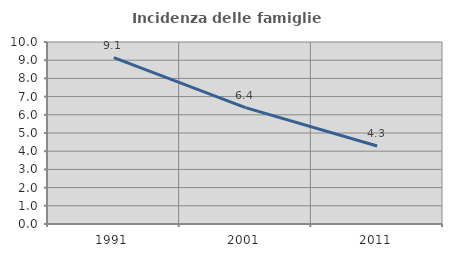
| Category | Incidenza delle famiglie numerose |
|---|---|
| 1991.0 | 9.145 |
| 2001.0 | 6.397 |
| 2011.0 | 4.284 |